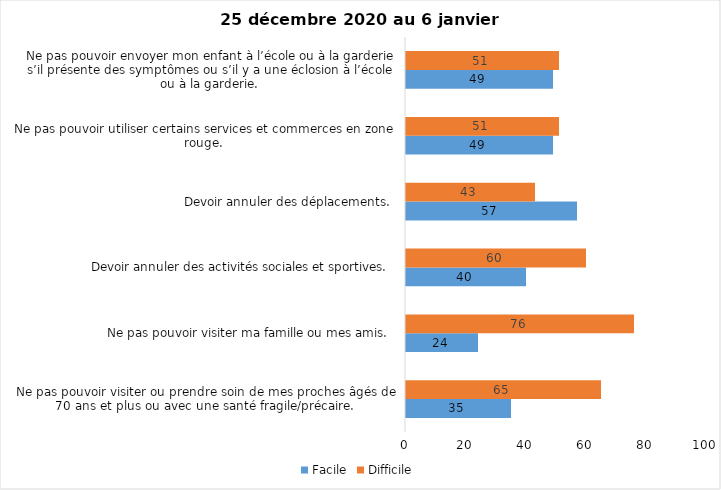
| Category | Facile | Difficile |
|---|---|---|
| Ne pas pouvoir visiter ou prendre soin de mes proches âgés de 70 ans et plus ou avec une santé fragile/précaire.  | 35 | 65 |
| Ne pas pouvoir visiter ma famille ou mes amis.  | 24 | 76 |
| Devoir annuler des activités sociales et sportives.  | 40 | 60 |
| Devoir annuler des déplacements.  | 57 | 43 |
| Ne pas pouvoir utiliser certains services et commerces en zone rouge.  | 49 | 51 |
| Ne pas pouvoir envoyer mon enfant à l’école ou à la garderie s’il présente des symptômes ou s’il y a une éclosion à l’école ou à la garderie.  | 49 | 51 |